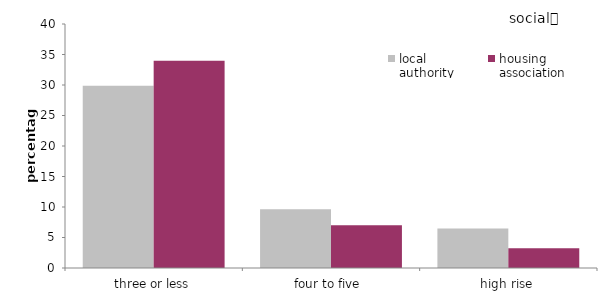
| Category | local 
authority | housing 
association |
|---|---|---|
| three or less | 29.889 | 33.962 |
| four to five  | 9.647 | 7.01 |
| high rise | 6.475 | 3.218 |